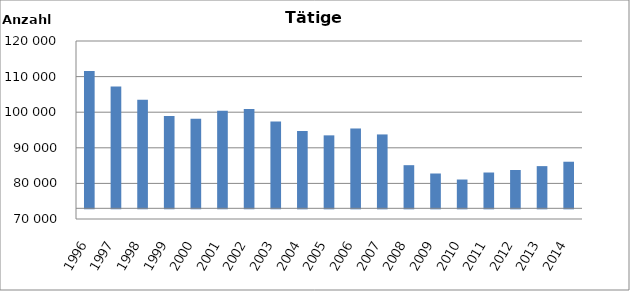
| Category | Series 0 |
|---|---|
| 1996.0 | 111544 |
| 1997.0 | 107253 |
| 1998.0 | 103463 |
| 1999.0 | 98926 |
| 2000.0 | 98154 |
| 2001.0 | 100422 |
| 2002.0 | 100868 |
| 2003.0 | 97367 |
| 2004.0 | 94725 |
| 2005.0 | 93496 |
| 2006.0 | 95427 |
| 2007.0 | 93755 |
| 2008.0 | 85118 |
| 2009.0 | 82782 |
| 2010.0 | 81089 |
| 2011.0 | 83058 |
| 2012.0 | 83766 |
| 2013.0 | 84853 |
| 2014.0 | 86087 |